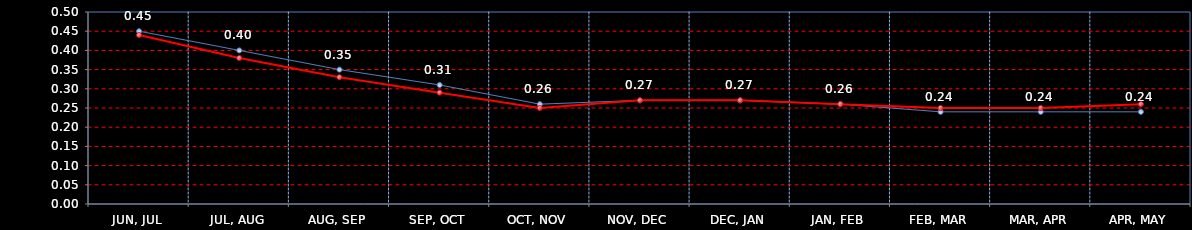
| Category | Last | Settlement | First MA | Second MA | Third MA |
|---|---|---|---|---|---|
| JUN, JUL | 0.45 | 0.44 |  |  |  |
| JUL, AUG | 0.4 | 0.38 |  |  |  |
| AUG, SEP | 0.35 | 0.33 |  |  |  |
| SEP, OCT | 0.31 | 0.29 |  |  |  |
| OCT, NOV | 0.26 | 0.25 |  |  |  |
| NOV, DEC | 0.27 | 0.27 |  |  |  |
| DEC, JAN | 0.27 | 0.27 |  |  |  |
| JAN, FEB | 0.26 | 0.26 |  |  |  |
| FEB, MAR | 0.24 | 0.25 |  |  |  |
| MAR, APR | 0.24 | 0.25 |  |  |  |
| APR, MAY | 0.24 | 0.26 |  |  |  |